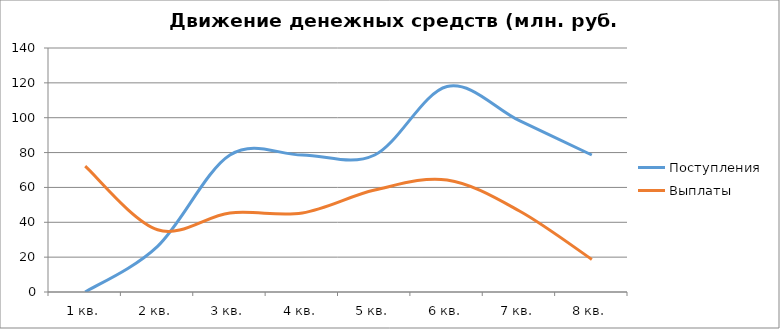
| Category | Поступления | Выплаты |
|---|---|---|
| 1 кв. | 0 | 72.154 |
| 2 кв. | 26.2 | 35.691 |
| 3 кв. | 78.6 | 45.375 |
| 4 кв. | 78.6 | 45.375 |
| 5 кв. | 78.6 | 58.509 |
| 6 кв. | 117.9 | 64.227 |
| 7 кв. | 98.3 | 46.491 |
| 8 кв. | 78.6 | 18.709 |